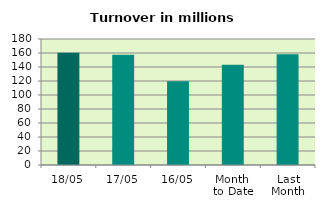
| Category | Series 0 |
|---|---|
| 18/05 | 160.406 |
| 17/05 | 157.593 |
| 16/05 | 119.695 |
| Month 
to Date | 143.277 |
| Last
Month | 158.303 |